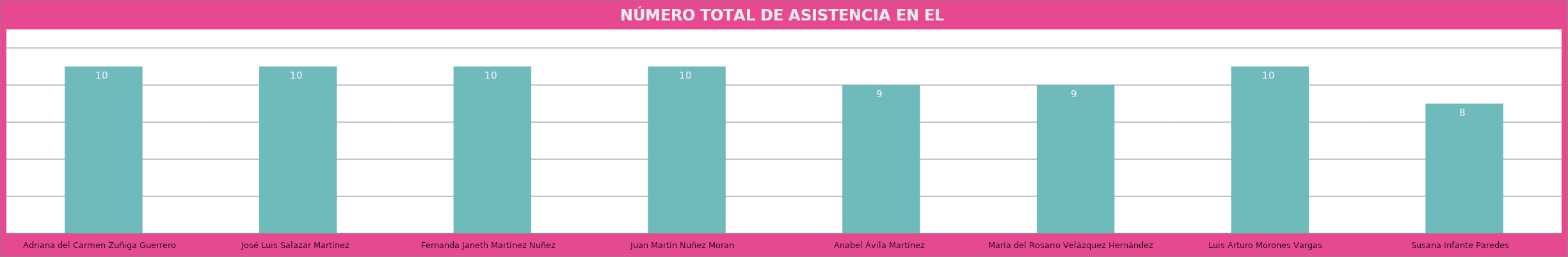
| Category | Adriana del Carmen Zuñiga Guerrero |
|---|---|
| Adriana del Carmen Zuñiga Guerrero | 10 |
| José Luis Salazar Martínez | 10 |
| Fernanda Janeth Martínez Nuñez | 10 |
| Juan Martín Nuñez Moran  | 10 |
| Anabel Ávila Martínez | 9 |
| María del Rosario Velázquez Hernández  | 9 |
| Luis Arturo Morones Vargas  | 10 |
| Susana Infante Paredes  | 8 |